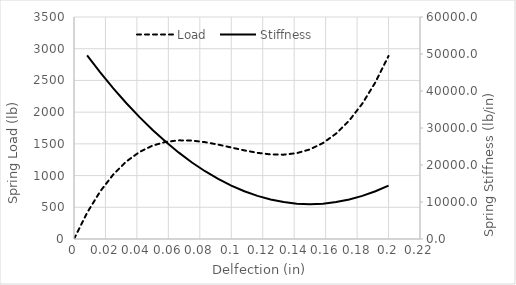
| Category | Load |
|---|---|
| 0.0 | 0 |
| 0.008333333333333333 | 413.569 |
| 0.016666666666666666 | 750.612 |
| 0.025 | 1018.085 |
| 0.03333333333333333 | 1222.945 |
| 0.041666666666666664 | 1372.149 |
| 0.049999999999999996 | 1472.654 |
| 0.05833333333333333 | 1531.417 |
| 0.06666666666666667 | 1555.396 |
| 0.075 | 1551.546 |
| 0.08333333333333333 | 1526.826 |
| 0.09166666666666666 | 1488.191 |
| 0.09999999999999999 | 1442.6 |
| 0.10833333333333332 | 1397.008 |
| 0.11666666666666665 | 1358.374 |
| 0.12499999999999999 | 1333.653 |
| 0.13333333333333333 | 1329.804 |
| 0.14166666666666666 | 1353.782 |
| 0.15 | 1412.546 |
| 0.15833333333333333 | 1513.051 |
| 0.16666666666666666 | 1662.255 |
| 0.175 | 1867.115 |
| 0.18333333333333332 | 2134.588 |
| 0.19166666666666665 | 2471.63 |
| 0.19999999999999998 | 2885.2 |